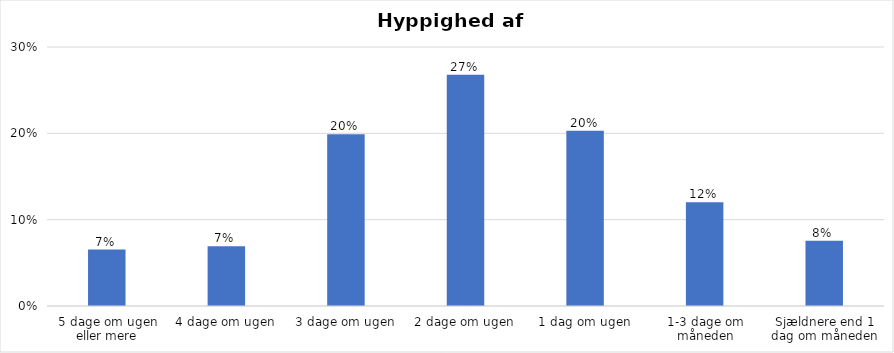
| Category | % |
|---|---|
| 5 dage om ugen eller mere | 0.065 |
| 4 dage om ugen | 0.069 |
| 3 dage om ugen | 0.199 |
| 2 dage om ugen | 0.268 |
| 1 dag om ugen | 0.203 |
| 1-3 dage om måneden | 0.12 |
| Sjældnere end 1 dag om måneden | 0.076 |